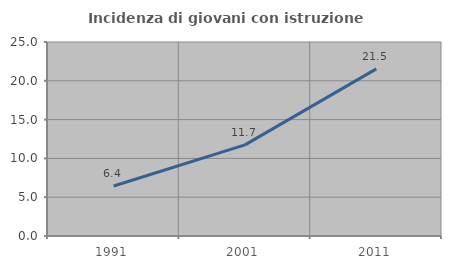
| Category | Incidenza di giovani con istruzione universitaria |
|---|---|
| 1991.0 | 6.438 |
| 2001.0 | 11.742 |
| 2011.0 | 21.538 |